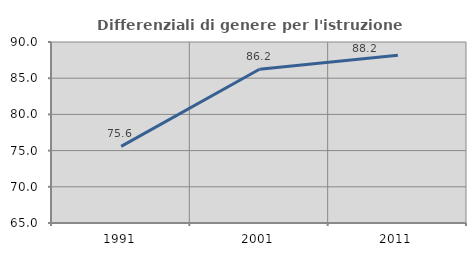
| Category | Differenziali di genere per l'istruzione superiore |
|---|---|
| 1991.0 | 75.579 |
| 2001.0 | 86.232 |
| 2011.0 | 88.174 |